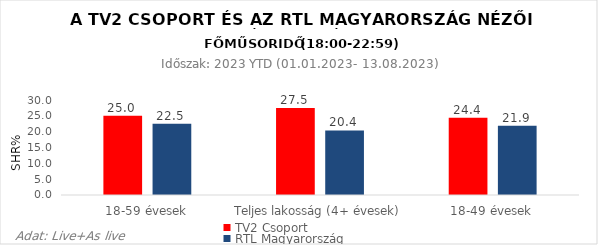
| Category | TV2 Csoport | RTL Magyarország |
|---|---|---|
| 18-59 évesek | 25 | 22.5 |
| Teljes lakosság (4+ évesek) | 27.5 | 20.4 |
| 18-49 évesek | 24.4 | 21.9 |